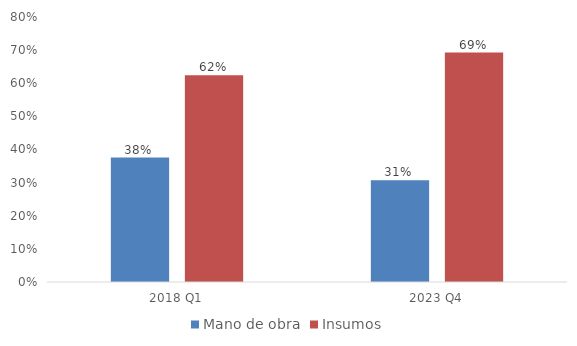
| Category | Mano de obra | Insumos |
|---|---|---|
| 2018 Q1 | 0.376 | 0.624 |
| 2023 Q4 | 0.307 | 0.693 |